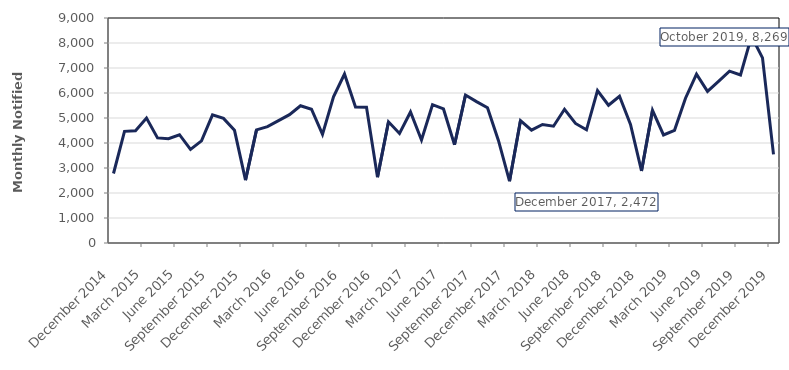
| Category | Series 0 | December 2017 2,472 | October 2019 8,269 |
|---|---|---|---|
| 2014-12-01 | 2780 |  |  |
| 2015-01-01 | 4466 |  |  |
| 2015-02-01 | 4492 |  |  |
| 2015-03-01 | 4995 |  |  |
| 2015-04-01 | 4204 |  |  |
| 2015-05-01 | 4172 |  |  |
| 2015-06-01 | 4331 |  |  |
| 2015-07-01 | 3743 |  |  |
| 2015-08-01 | 4083 |  |  |
| 2015-09-01 | 5127 |  |  |
| 2015-10-01 | 4983 |  |  |
| 2015-11-01 | 4507 |  |  |
| 2015-12-01 | 2513 |  |  |
| 2016-01-01 | 4527 |  |  |
| 2016-02-01 | 4654 |  |  |
| 2016-03-01 | 4894 |  |  |
| 2016-04-01 | 5134 |  |  |
| 2016-05-01 | 5491 |  |  |
| 2016-06-01 | 5350 |  |  |
| 2016-07-01 | 4342 |  |  |
| 2016-08-01 | 5846 |  |  |
| 2016-09-01 | 6758 |  |  |
| 2016-10-01 | 5438 |  |  |
| 2016-11-01 | 5433 |  |  |
| 2016-12-01 | 2634 |  |  |
| 2017-01-01 | 4847 |  |  |
| 2017-02-01 | 4383 |  |  |
| 2017-03-01 | 5241 |  |  |
| 2017-04-01 | 4120 |  |  |
| 2017-05-01 | 5532 |  |  |
| 2017-06-01 | 5362 |  |  |
| 2017-07-01 | 3929 |  |  |
| 2017-08-01 | 5919 |  |  |
| 2017-09-01 | 5656 |  |  |
| 2017-10-01 | 5408 |  |  |
| 2017-11-01 | 4092 |  |  |
| 2017-12-01 | 2472 |  |  |
| 2018-01-01 | 4900 |  |  |
| 2018-02-01 | 4515 |  |  |
| 2018-03-01 | 4742 |  |  |
| 2018-04-01 | 4671 |  |  |
| 2018-05-01 | 5349 |  |  |
| 2018-06-01 | 4782 |  |  |
| 2018-07-01 | 4528 |  |  |
| 2018-08-01 | 6097 |  |  |
| 2018-09-01 | 5510 |  |  |
| 2018-10-01 | 5868 |  |  |
| 2018-11-01 | 4740 |  |  |
| 2018-12-01 | 2884 |  |  |
| 2019-01-01 | 5305 |  |  |
| 2019-02-01 | 4322 |  |  |
| 2019-03-01 | 4507 |  |  |
| 2019-04-01 | 5791 |  |  |
| 2019-05-01 | 6751 |  |  |
| 2019-06-01 | 6065 |  |  |
| 2019-07-01 | 6467 |  |  |
| 2019-08-01 | 6873 |  |  |
| 2019-09-01 | 6721 |  |  |
| 2019-10-01 | 8269 |  |  |
| 2019-11-01 | 7407 |  |  |
| 2019-12-01 | 3545 |  |  |